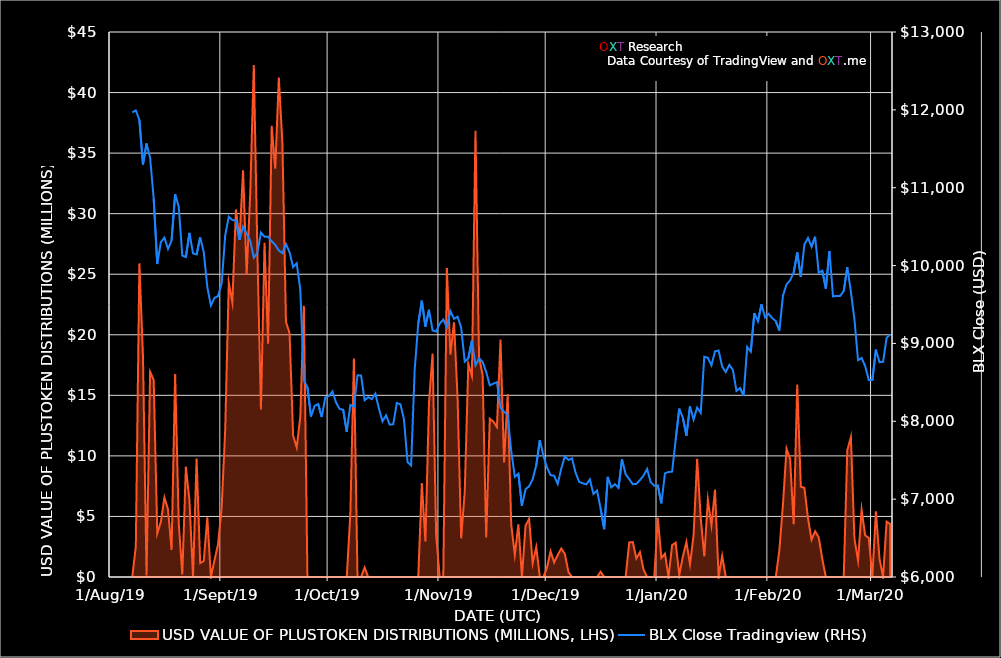
| Category | BLX Close Tradingview (RHS) |
|---|---|
| 2020-03-06 | 9116.82 |
| 2020-03-05 | 9071.15 |
| 2020-03-04 | 8763.43 |
| 2020-03-03 | 8759 |
| 2020-03-02 | 8919.65 |
| 2020-03-01 | 8530.64 |
| 2020-02-29 | 8531.47 |
| 2020-02-28 | 8707.85 |
| 2020-02-27 | 8812.39 |
| 2020-02-26 | 8785.3 |
| 2020-02-25 | 9307.11 |
| 2020-02-24 | 9666.11 |
| 2020-02-23 | 9978.45 |
| 2020-02-22 | 9673.07 |
| 2020-02-21 | 9610.5 |
| 2020-02-20 | 9610.5 |
| 2020-02-19 | 9604.38 |
| 2020-02-18 | 10185.27 |
| 2020-02-17 | 9704 |
| 2020-02-16 | 9933.99 |
| 2020-02-15 | 9909.16 |
| 2020-02-14 | 10370.48 |
| 2020-02-13 | 10241.94 |
| 2020-02-12 | 10354.35 |
| 2020-02-11 | 10271.13 |
| 2020-02-10 | 9852.96 |
| 2020-02-09 | 10167.88 |
| 2020-02-08 | 9907.49 |
| 2020-02-07 | 9810.73 |
| 2020-02-06 | 9757.52 |
| 2020-02-05 | 9611.92 |
| 2020-02-04 | 9165.5 |
| 2020-02-03 | 9286.29 |
| 2020-02-02 | 9325.99 |
| 2020-02-01 | 9379.93 |
| 2020-01-31 | 9333.54 |
| 2020-01-30 | 9503.3 |
| 2020-01-29 | 9283.62 |
| 2020-01-28 | 9389.3 |
| 2020-01-27 | 8893.78 |
| 2020-01-26 | 8954.55 |
| 2020-01-25 | 8329.52 |
| 2020-01-24 | 8426.62 |
| 2020-01-23 | 8389.27 |
| 2020-01-22 | 8660.95 |
| 2020-01-21 | 8723.71 |
| 2020-01-20 | 8631.63 |
| 2020-01-19 | 8702.65 |
| 2020-01-18 | 8908.93 |
| 2020-01-17 | 8898.19 |
| 2020-01-16 | 8719.51 |
| 2020-01-15 | 8815.06 |
| 2020-01-14 | 8829.11 |
| 2020-01-13 | 8107.89 |
| 2020-01-12 | 8175.9 |
| 2020-01-11 | 8022.1 |
| 2020-01-10 | 8192.25 |
| 2020-01-09 | 7816.44 |
| 2020-01-08 | 8045.25 |
| 2020-01-07 | 8162.71 |
| 2020-01-06 | 7763.22 |
| 2020-01-05 | 7353.24 |
| 2020-01-04 | 7349.68 |
| 2020-01-03 | 7330.79 |
| 2020-01-02 | 6945.79 |
| 2020-01-01 | 7176.37 |
| 2019-12-31 | 7171.07 |
| 2019-12-30 | 7218.72 |
| 2019-12-29 | 7387.36 |
| 2019-12-28 | 7302.03 |
| 2019-12-27 | 7245.33 |
| 2019-12-26 | 7195.41 |
| 2019-12-25 | 7191.94 |
| 2019-12-24 | 7256.66 |
| 2019-12-23 | 7318.71 |
| 2019-12-22 | 7513.96 |
| 2019-12-21 | 7144.47 |
| 2019-12-20 | 7192.96 |
| 2019-12-19 | 7150.63 |
| 2019-12-18 | 7286.79 |
| 2019-12-17 | 6613.91 |
| 2019-12-16 | 6879.44 |
| 2019-12-15 | 7112.19 |
| 2019-12-14 | 7065.92 |
| 2019-12-13 | 7253.09 |
| 2019-12-12 | 7189.39 |
| 2019-12-11 | 7204.08 |
| 2019-12-10 | 7222.02 |
| 2019-12-09 | 7338.88 |
| 2019-12-08 | 7522.76 |
| 2019-12-07 | 7503.3 |
| 2019-12-06 | 7547.74 |
| 2019-12-05 | 7394.53 |
| 2019-12-04 | 7195.29 |
| 2019-12-03 | 7300.18 |
| 2019-12-02 | 7308.44 |
| 2019-12-01 | 7407.56 |
| 2019-11-30 | 7557.86 |
| 2019-11-29 | 7759.12 |
| 2019-11-28 | 7434.14 |
| 2019-11-27 | 7257.78 |
| 2019-11-26 | 7164.98 |
| 2019-11-25 | 7127.85 |
| 2019-11-24 | 6914.95 |
| 2019-11-23 | 7326.86 |
| 2019-11-22 | 7287.5 |
| 2019-11-21 | 7618.6 |
| 2019-11-20 | 8083.95 |
| 2019-11-19 | 8123.54 |
| 2019-11-18 | 8175.59 |
| 2019-11-17 | 8503.31 |
| 2019-11-16 | 8484.65 |
| 2019-11-15 | 8461.78 |
| 2019-11-14 | 8632.32 |
| 2019-11-13 | 8762.72 |
| 2019-11-12 | 8807.33 |
| 2019-11-11 | 8720.21 |
| 2019-11-10 | 9035.84 |
| 2019-11-09 | 8809.65 |
| 2019-11-08 | 8766.54 |
| 2019-11-07 | 9202.02 |
| 2019-11-06 | 9343.21 |
| 2019-11-05 | 9316.3 |
| 2019-11-04 | 9415.33 |
| 2019-11-03 | 9207.4 |
| 2019-11-02 | 9306.17 |
| 2019-11-01 | 9255.15 |
| 2019-10-31 | 9153.45 |
| 2019-10-30 | 9166.64 |
| 2019-10-29 | 9432.4 |
| 2019-10-28 | 9215.6 |
| 2019-10-27 | 9548.41 |
| 2019-10-26 | 9255.33 |
| 2019-10-25 | 8666.32 |
| 2019-10-24 | 7432.1 |
| 2019-10-23 | 7475 |
| 2019-10-22 | 8026.46 |
| 2019-10-21 | 8219.55 |
| 2019-10-20 | 8234.29 |
| 2019-10-19 | 7961.79 |
| 2019-10-18 | 7956.83 |
| 2019-10-17 | 8076.61 |
| 2019-10-16 | 7999 |
| 2019-10-15 | 8162.15 |
| 2019-10-14 | 8355.19 |
| 2019-10-13 | 8284.54 |
| 2019-10-12 | 8309.4 |
| 2019-10-11 | 8269.85 |
| 2019-10-10 | 8588.54 |
| 2019-10-09 | 8590.29 |
| 2019-10-08 | 8187.61 |
| 2019-10-07 | 8209.47 |
| 2019-10-06 | 7863.73 |
| 2019-10-05 | 8148.55 |
| 2019-10-04 | 8158.37 |
| 2019-10-03 | 8241.39 |
| 2019-10-02 | 8383.87 |
| 2019-10-01 | 8323.57 |
| 2019-09-30 | 8306.36 |
| 2019-09-29 | 8055.05 |
| 2019-09-28 | 8221.75 |
| 2019-09-27 | 8196.62 |
| 2019-09-26 | 8061.03 |
| 2019-09-25 | 8437.03 |
| 2019-09-24 | 8532.29 |
| 2019-09-23 | 9691.63 |
| 2019-09-22 | 10030.61 |
| 2019-09-21 | 9980.44 |
| 2019-09-20 | 10170.33 |
| 2019-09-19 | 10276.88 |
| 2019-09-18 | 10159.2 |
| 2019-09-17 | 10192.28 |
| 2019-09-16 | 10265.29 |
| 2019-09-15 | 10311.61 |
| 2019-09-14 | 10370.58 |
| 2019-09-13 | 10371.4 |
| 2019-09-12 | 10424.68 |
| 2019-09-11 | 10162.27 |
| 2019-09-10 | 10100.6 |
| 2019-09-09 | 10317.42 |
| 2019-09-08 | 10408.5 |
| 2019-09-07 | 10499.96 |
| 2019-09-06 | 10331.28 |
| 2019-09-05 | 10578.71 |
| 2019-09-04 | 10583.9 |
| 2019-09-03 | 10627.31 |
| 2019-09-02 | 10388.4 |
| 2019-09-01 | 9768.58 |
| 2019-08-31 | 9608.43 |
| 2019-08-30 | 9584.37 |
| 2019-08-29 | 9487.34 |
| 2019-08-28 | 9723.44 |
| 2019-08-27 | 10173.17 |
| 2019-08-26 | 10362.48 |
| 2019-08-25 | 10142.81 |
| 2019-08-24 | 10156.82 |
| 2019-08-23 | 10419.92 |
| 2019-08-22 | 10109.67 |
| 2019-08-21 | 10129.57 |
| 2019-08-20 | 10756.96 |
| 2019-08-19 | 10918.79 |
| 2019-08-18 | 10321.53 |
| 2019-08-17 | 10213.38 |
| 2019-08-16 | 10358.69 |
| 2019-08-15 | 10301.61 |
| 2019-08-14 | 10019.64 |
| 2019-08-13 | 10858.36 |
| 2019-08-12 | 11384.48 |
| 2019-08-11 | 11568.85 |
| 2019-08-10 | 11298.45 |
| 2019-08-09 | 11870.5 |
| 2019-08-08 | 11993.75 |
| 2019-08-07 | 11966.98 |